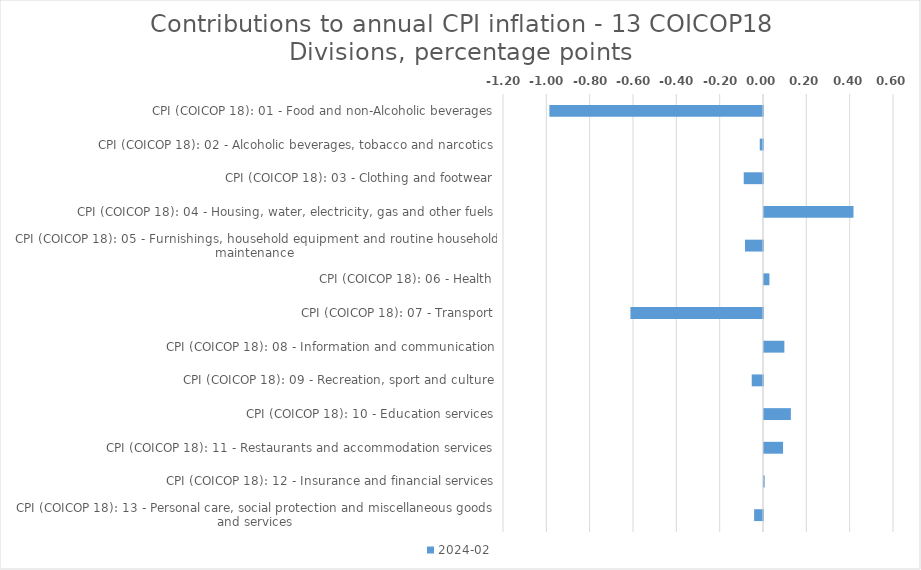
| Category | 2024-02 |
|---|---|
| CPI (COICOP 18): 01 - Food and non-Alcoholic beverages | -0.986 |
| CPI (COICOP 18): 02 - Alcoholic beverages, tobacco and narcotics | -0.015 |
| CPI (COICOP 18): 03 - Clothing and footwear | -0.089 |
| CPI (COICOP 18): 04 - Housing, water, electricity, gas and other fuels | 0.413 |
| CPI (COICOP 18): 05 - Furnishings, household equipment and routine household maintenance | -0.083 |
| CPI (COICOP 18): 06 - Health | 0.025 |
| CPI (COICOP 18): 07 - Transport | -0.612 |
| CPI (COICOP 18): 08 - Information and communication | 0.094 |
| CPI (COICOP 18): 09 - Recreation, sport and culture | -0.052 |
| CPI (COICOP 18): 10 - Education services | 0.124 |
| CPI (COICOP 18): 11 - Restaurants and accommodation services | 0.088 |
| CPI (COICOP 18): 12 - Insurance and financial services | 0.003 |
| CPI (COICOP 18): 13 - Personal care, social protection and miscellaneous goods and services | -0.041 |